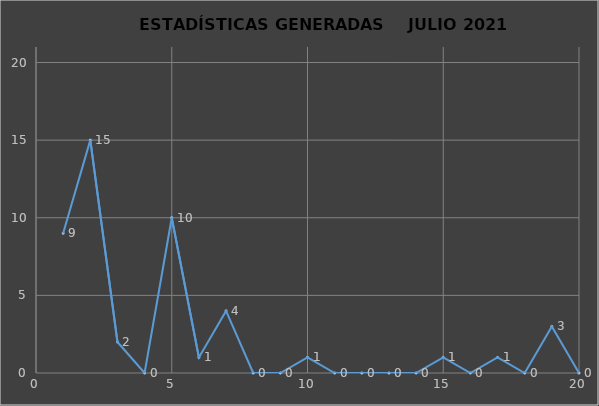
| Category |                   ESTADÍSTICAS GENERADAS     PERÍODO JULIO 2021 CANTIDAD |
|---|---|
| 0 | 9 |
| 1 | 15 |
| 2 | 2 |
| 3 | 0 |
| 4 | 10 |
| 5 | 1 |
| 6 | 4 |
| 7 | 0 |
| 8 | 0 |
| 9 | 1 |
| 10 | 0 |
| 11 | 0 |
| 12 | 0 |
| 13 | 0 |
| 14 | 1 |
| 15 | 0 |
| 16 | 1 |
| 17 | 0 |
| 18 | 3 |
| 19 | 0 |